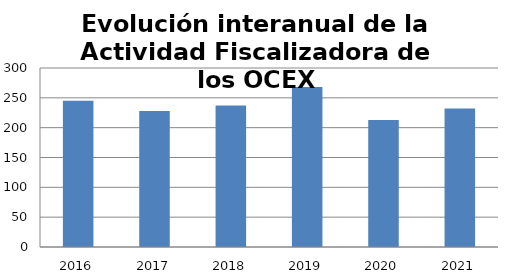
| Category | Series 0 |
|---|---|
| 2016.0 | 245 |
| 2017.0 | 228 |
| 2018.0 | 237 |
| 2019.0 | 268 |
| 2020.0 | 213 |
| 2021.0 | 232 |